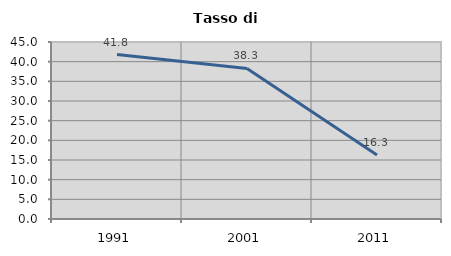
| Category | Tasso di disoccupazione   |
|---|---|
| 1991.0 | 41.806 |
| 2001.0 | 38.27 |
| 2011.0 | 16.265 |